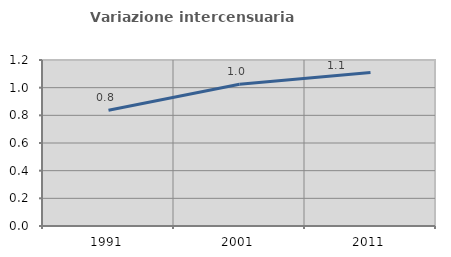
| Category | Variazione intercensuaria annua |
|---|---|
| 1991.0 | 0.837 |
| 2001.0 | 1.024 |
| 2011.0 | 1.11 |